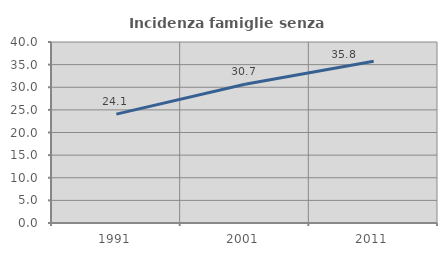
| Category | Incidenza famiglie senza nuclei |
|---|---|
| 1991.0 | 24.06 |
| 2001.0 | 30.667 |
| 2011.0 | 35.751 |